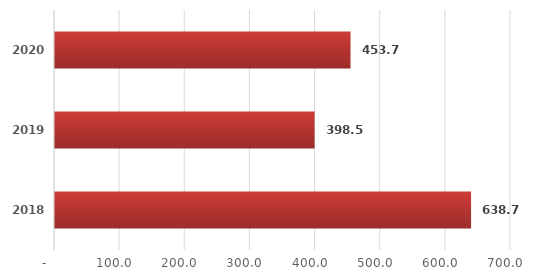
| Category | Series 0 |
|---|---|
| 2018.0 | 638.722 |
| 2019.0 | 398.494 |
| 2020.0 | 453.675 |